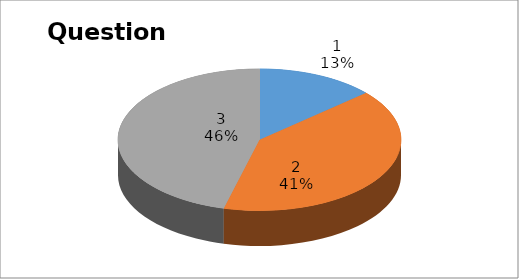
| Category | Series 0 |
|---|---|
| 0 | 5 |
| 1 | 15 |
| 2 | 17 |